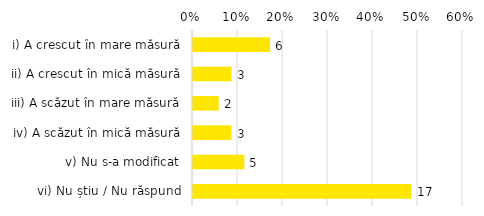
| Category | Total |
|---|---|
| i) A crescut în mare măsură | 0.171 |
| ii) A crescut în mică măsură | 0.086 |
| iii) A scăzut în mare măsură | 0.057 |
| iv) A scăzut în mică măsură | 0.086 |
| v) Nu s-a modificat | 0.114 |
| vi) Nu știu / Nu răspund | 0.486 |